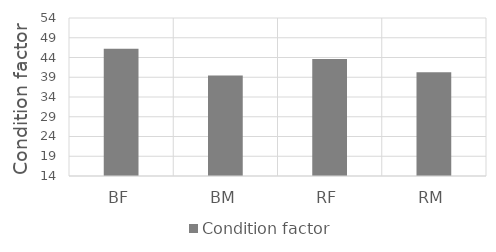
| Category | Condition factor |
|---|---|
| BF | 46.231 |
| BM | 39.448 |
| RF | 43.627 |
| RM | 40.282 |